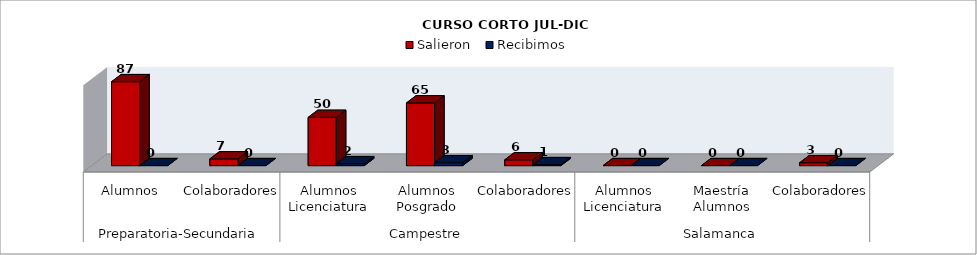
| Category | Salieron  | Recibimos |
|---|---|---|
| 0 | 87 | 0 |
| 1 | 7 | 0 |
| 2 | 50 | 2 |
| 3 | 65 | 3 |
| 4 | 6 | 1 |
| 5 | 0 | 0 |
| 6 | 0 | 0 |
| 7 | 3 | 0 |